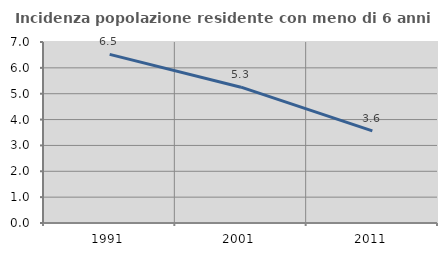
| Category | Incidenza popolazione residente con meno di 6 anni |
|---|---|
| 1991.0 | 6.522 |
| 2001.0 | 5.252 |
| 2011.0 | 3.56 |